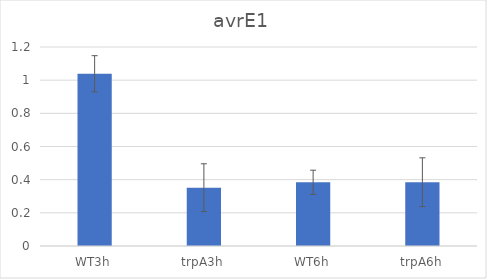
| Category | Series 0 |
|---|---|
| WT3h | 1.039 |
| trpA3h | 0.352 |
| WT6h | 0.384 |
| trpA6h | 0.385 |